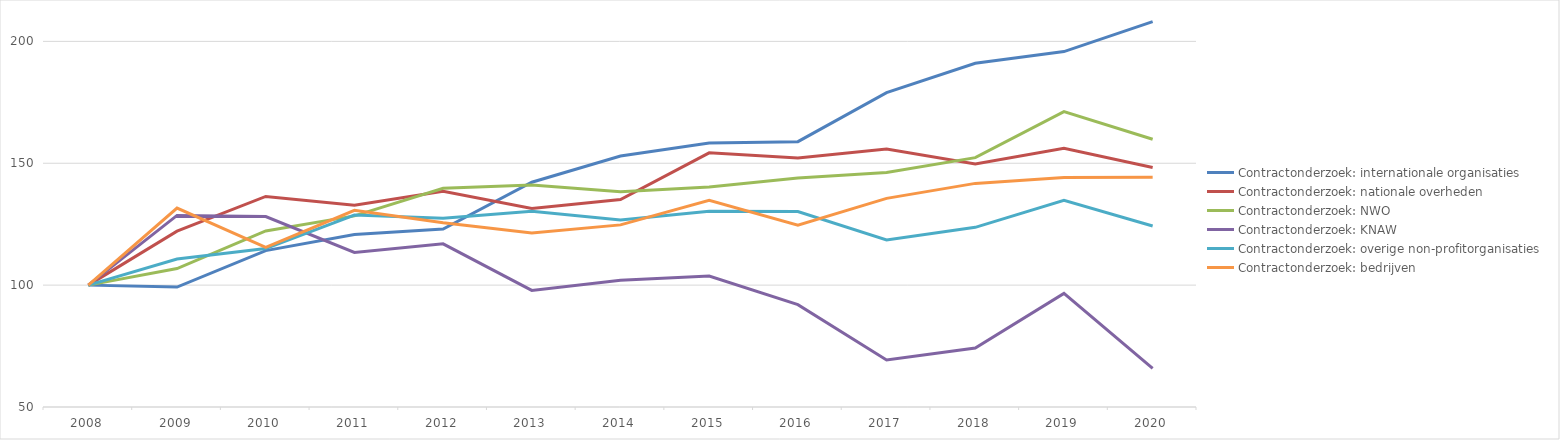
| Category | Contractonderzoek: internationale organisaties  | Contractonderzoek: nationale overheden | Contractonderzoek: NWO | Contractonderzoek: KNAW | Contractonderzoek: overige non-profitorganisaties | Contractonderzoek: bedrijven |
|---|---|---|---|---|---|---|
| 2008.0 | 100 | 100 | 100 | 100 | 100 | 100 |
| 2009.0 | 99.189 | 122.144 | 106.817 | 128.598 | 110.731 | 131.63 |
| 2010.0 | 114.149 | 136.372 | 122.232 | 128.13 | 115.008 | 115.482 |
| 2011.0 | 120.732 | 132.753 | 128.402 | 113.399 | 128.759 | 130.673 |
| 2012.0 | 123.039 | 138.484 | 139.707 | 116.942 | 127.459 | 125.593 |
| 2013.0 | 142.22 | 131.403 | 141.031 | 97.83 | 130.305 | 121.413 |
| 2014.0 | 152.96 | 135.095 | 138.266 | 102.038 | 126.706 | 124.712 |
| 2015.0 | 158.279 | 154.264 | 140.232 | 103.727 | 130.325 | 134.846 |
| 2016.0 | 158.86 | 152.108 | 143.909 | 91.981 | 130.207 | 124.638 |
| 2017.0 | 178.967 | 155.848 | 146.24 | 69.322 | 118.493 | 135.598 |
| 2018.0 | 191.019 | 149.662 | 152.304 | 74.183 | 123.704 | 141.741 |
| 2019.0 | 195.808 | 156.188 | 171.207 | 96.584 | 134.785 | 144.121 |
| 2020.0 | 208.076 | 148.256 | 159.854 | 65.851 | 124.24 | 144.286 |